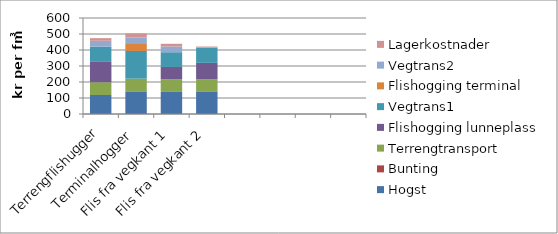
| Category | Hogst | Bunting | Terrengtransport | Flishogging lunneplass | Vegtrans1 | Flishogging terminal | Vegtrans2 | Lagerkostnader |
|---|---|---|---|---|---|---|---|---|
| Terrengflishugger | 118.686 | 0 | 79.584 | 131.145 | 92.024 | 0 | 36.129 | 16.644 |
| Terminalhogger | 137.88 | 0 | 82.904 | 0 | 172.915 | 49.115 | 36.129 | 24.82 |
| Flis fra vegkant 1 | 137.88 | 0 | 79.584 | 76.546 | 92.024 | 0 | 36.129 | 16.644 |
| Flis fra vegkant 2 | 137.88 | 0 | 79.584 | 102.283 | 94.635 | 0 | 0 | 7.238 |